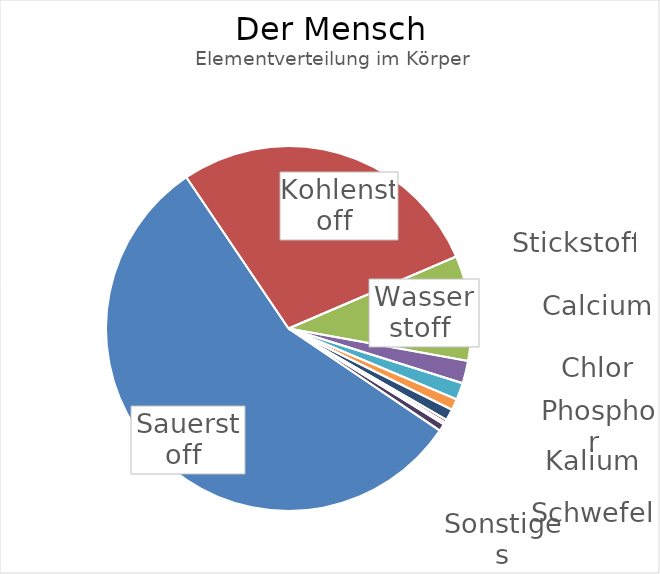
| Category | Masse |
|---|---|
| Sauerstoff  | 42.075 |
| Kohlenstoff  | 21 |
| Wasserstoff  | 6.975 |
| Stickstoff  | 1.5 |
| Calcium | 1.125 |
| Chlor  | 0.75 |
| Phosphor  | 0.75 |
| Kalium  | 0.188 |
| Schwefel  | 0.15 |
| Sonstiges | 0.487 |